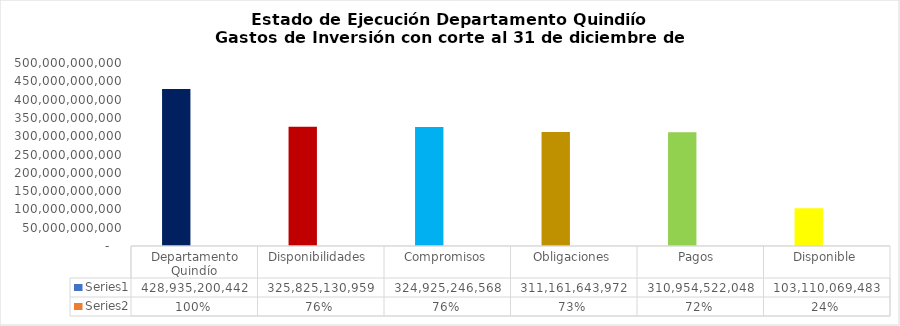
| Category | Series 0 | Series 1 |
|---|---|---|
| Departamento Quindío | 428935200441.5 | 1 |
| Disponibilidades  | 325825130958.69 | 0.76 |
| Compromisos | 324925246568.3 | 0.758 |
| Obligaciones | 311161643971.6 | 0.725 |
| Pagos  | 310954522047.67 | 0.725 |
|  Disponible  | 103110069482.81 | 0.24 |